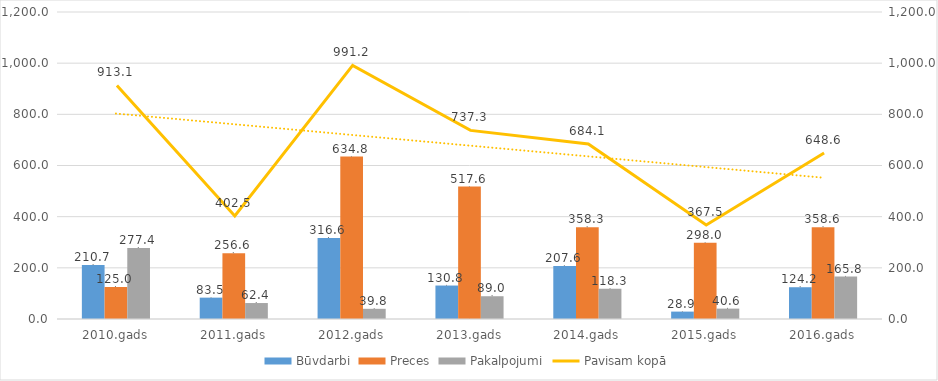
| Category | Būvdarbi | Preces | Pakalpojumi |
|---|---|---|---|
| 2010.gads | 210.7 | 125 | 277.4 |
| 2011.gads | 83.5 | 256.6 | 62.4 |
| 2012.gads | 316.6 | 634.8 | 39.8 |
| 2013.gads | 130.8 | 517.6 | 89 |
| 2014.gads | 207.6 | 358.3 | 118.3 |
| 2015.gads | 28.9 | 298 | 40.6 |
| 2016.gads | 124.2 | 358.6 | 165.8 |